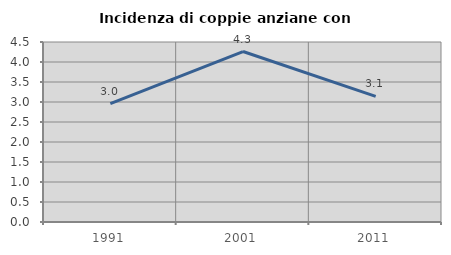
| Category | Incidenza di coppie anziane con figli |
|---|---|
| 1991.0 | 2.96 |
| 2001.0 | 4.262 |
| 2011.0 | 3.142 |